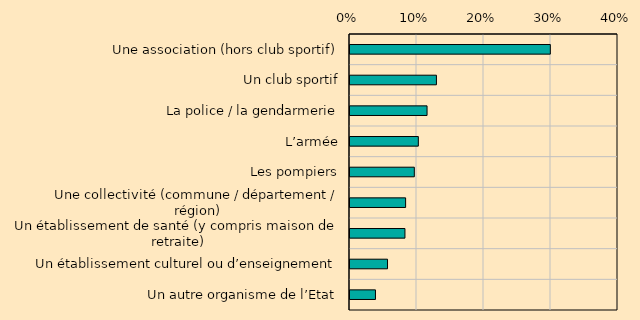
| Category | Series 0 |
|---|---|
| Une association (hors club sportif) | 0.299 |
| Un club sportif | 0.129 |
| La police / la gendarmerie | 0.115 |
| L’armée | 0.102 |
| Les pompiers | 0.096 |
| Une collectivité (commune / département / région) | 0.083 |
| Un établissement de santé (y compris maison de retraite) | 0.082 |
| Un établissement culturel ou d’enseignement | 0.056 |
| Un autre organisme de l’Etat | 0.038 |